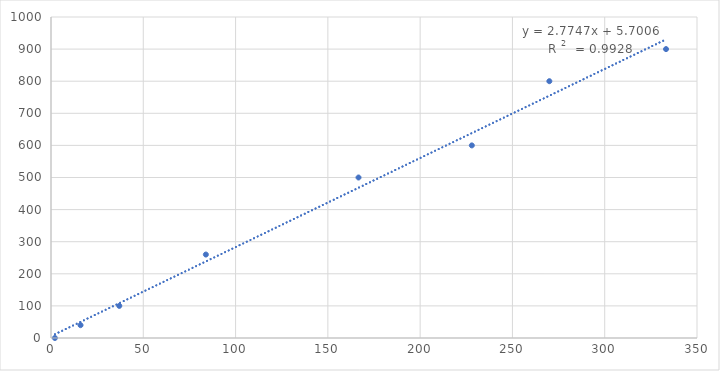
| Category | Concentration (microgram/mL) |
|---|---|
| 2.12 | 0 |
| 37.0 | 100 |
| 83.9 | 260 |
| 166.61 | 500 |
| 270.0 | 800 |
| 333.22 | 900 |
| 228.0 | 600 |
| 16.0 | 40 |